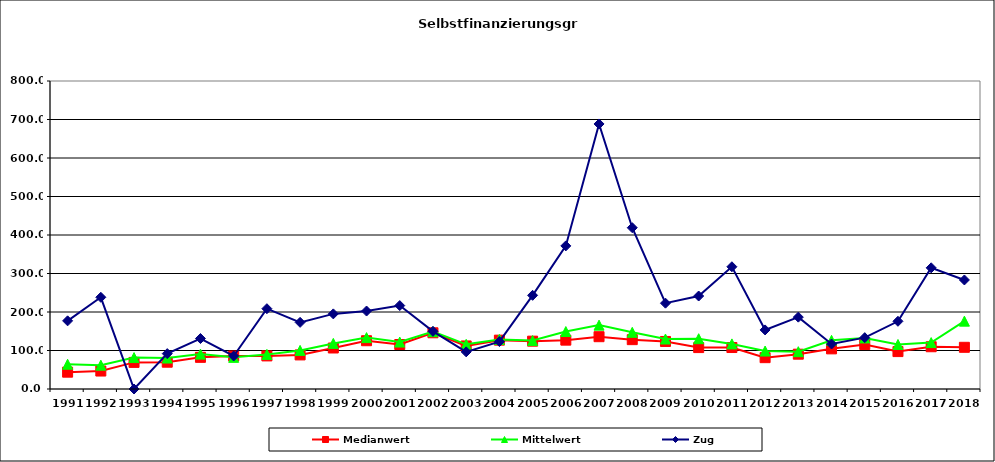
| Category | Medianwert | Mittelwert | Zug |
|---|---|---|---|
| 1991.0 | 43.7 | 64.292 | 177 |
| 1992.0 | 46.65 | 61.956 | 238.2 |
| 1993.0 | 69.1 | 81.629 | 0 |
| 1994.0 | 69.6 | 80.414 | 91.9 |
| 1995.0 | 82.2 | 90.605 | 131.1 |
| 1996.0 | 85.7 | 82.181 | 85.7 |
| 1997.0 | 85.95 | 89.873 | 208.6 |
| 1998.0 | 88.55 | 100.246 | 173.1 |
| 1999.0 | 106.5 | 118.448 | 195.1 |
| 2000.0 | 125.4 | 133.52 | 202.5 |
| 2001.0 | 115.55 | 121.946 | 216.7 |
| 2002.0 | 146 | 148.915 | 149.8 |
| 2003.0 | 111.85 | 116.062 | 96.5 |
| 2004.0 | 126.9 | 128.865 | 123.1 |
| 2005.0 | 124.25 | 125.821 | 243.3 |
| 2006.0 | 126.9 | 149.264 | 371.7 |
| 2007.0 | 135.85 | 165.89 | 688.4 |
| 2008.0 | 128.185 | 147.205 | 418.9 |
| 2009.0 | 123.49 | 129.818 | 222.9 |
| 2010.0 | 107.55 | 130.614 | 241.5 |
| 2011.0 | 107.75 | 117.142 | 317.51 |
| 2012.0 | 81.375 | 98.616 | 153.44 |
| 2013.0 | 90.385 | 96.916 | 186.61 |
| 2014.0 | 104.25 | 126.395 | 116.882 |
| 2015.0 | 115.5 | 132.601 | 133.336 |
| 2016.0 | 97.18 | 115.652 | 175.882 |
| 2017.0 | 109.75 | 120.565 | 314.771 |
| 2018.0 | 108.3 | 176.291 | 283.2 |